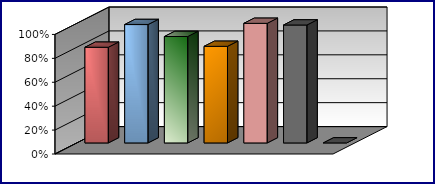
| Category | Series 0 | Series 1 | Series 2 | Series 3 |
|---|---|---|---|---|
| 0 | 0.8 |  |  |  |
| 1 | 0.99 |  |  |  |
| 2 | 0.89 |  |  |  |
| 3 | 0.808 |  |  |  |
| 4 | 1 |  |  |  |
| 5 | 0.986 |  |  |  |
| 6 | 0 |  |  |  |